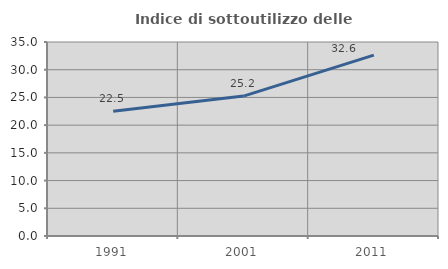
| Category | Indice di sottoutilizzo delle abitazioni  |
|---|---|
| 1991.0 | 22.518 |
| 2001.0 | 25.237 |
| 2011.0 | 32.643 |